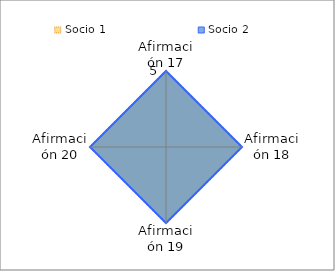
| Category | Socio 1 | Socio 2 |
|---|---|---|
| Afirmación 17 | 5 | 5 |
| Afirmación 18 | 5 | 5 |
| Afirmación 19 | 5 | 5 |
| Afirmación 20 | 5 | 5 |